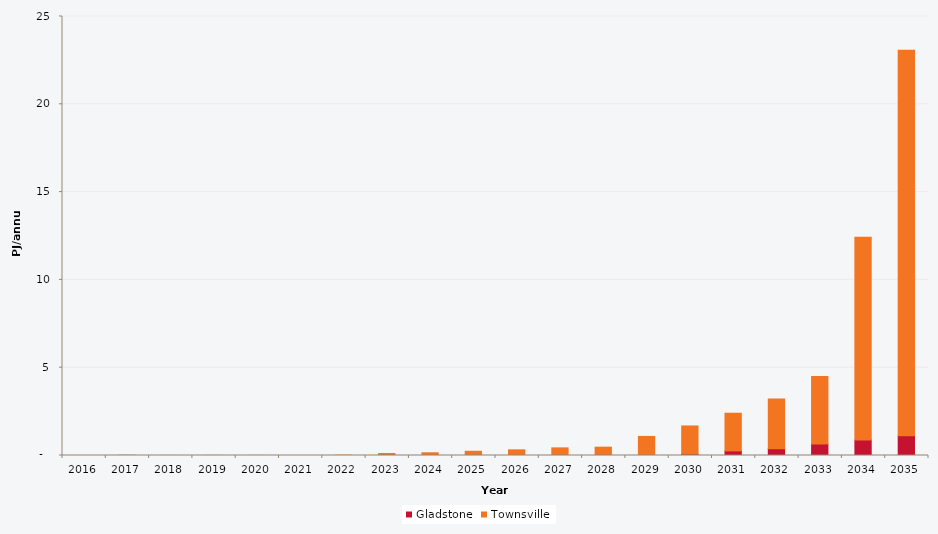
| Category | Gladstone | Townsville |
|---|---|---|
| 2016.0 | 0 | 0 |
| 2017.0 | 0 | 0.019 |
| 2018.0 | 0 | 0.002 |
| 2019.0 | 0 | 0.007 |
| 2020.0 | 0 | 0.004 |
| 2021.0 | 0 | 0 |
| 2022.0 | 0 | 0.017 |
| 2023.0 | 0 | 0.113 |
| 2024.0 | 0 | 0.155 |
| 2025.0 | 0 | 0.24 |
| 2026.0 | 0 | 0.322 |
| 2027.0 | 0 | 0.434 |
| 2028.0 | 0.001 | 0.473 |
| 2029.0 | 0.006 | 1.081 |
| 2030.0 | 0.084 | 1.598 |
| 2031.0 | 0.262 | 2.145 |
| 2032.0 | 0.386 | 2.833 |
| 2033.0 | 0.658 | 3.847 |
| 2034.0 | 0.888 | 11.54 |
| 2035.0 | 1.124 | 21.953 |